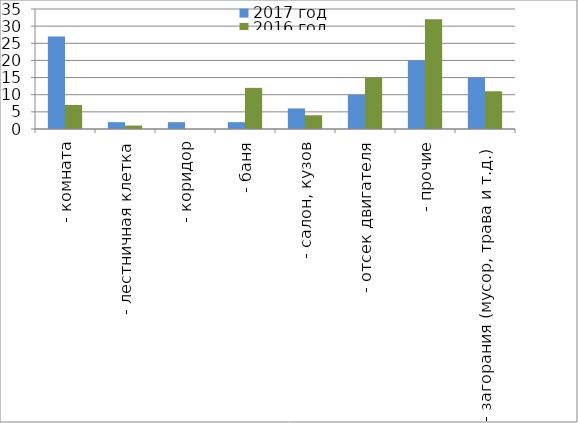
| Category | 2017 год | 2016 год |
|---|---|---|
|  - комната | 27 | 7 |
|  - лестничная клетка | 2 | 1 |
|  - коридор | 2 | 0 |
|  - баня | 2 | 12 |
|  - салон, кузов | 6 | 4 |
|  - отсек двигателя | 10 | 15 |
| - прочие | 20 | 32 |
| - загорания (мусор, трава и т.д.)  | 15 | 11 |